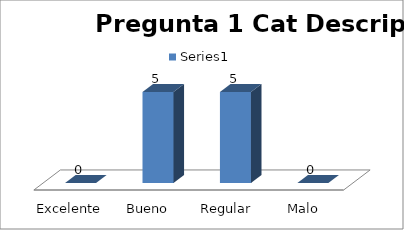
| Category | Series 0 |
|---|---|
| Excelente  | 0 |
| Bueno | 5 |
| Regular | 5 |
| Malo | 0 |